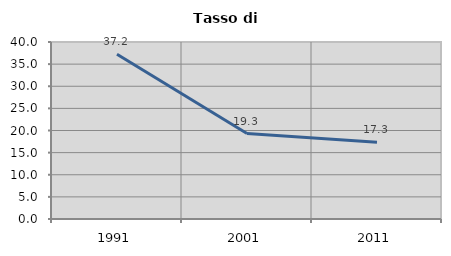
| Category | Tasso di disoccupazione   |
|---|---|
| 1991.0 | 37.219 |
| 2001.0 | 19.316 |
| 2011.0 | 17.343 |